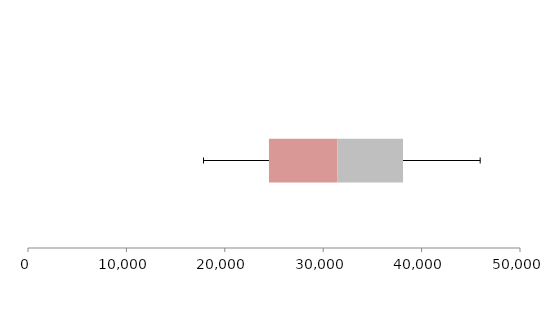
| Category | Series 1 | Series 2 | Series 3 |
|---|---|---|---|
| 0 | 24488.403 | 6970.017 | 6653.165 |